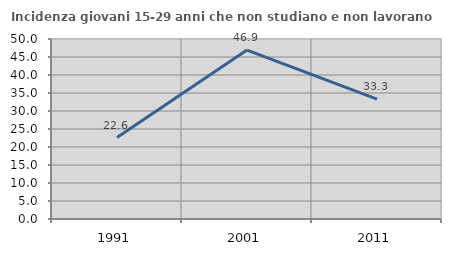
| Category | Incidenza giovani 15-29 anni che non studiano e non lavorano  |
|---|---|
| 1991.0 | 22.636 |
| 2001.0 | 46.93 |
| 2011.0 | 33.307 |